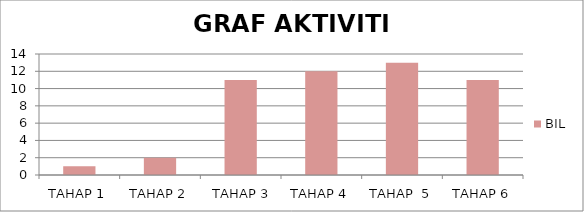
| Category | BIL |
|---|---|
| TAHAP 1 | 1 |
| TAHAP 2 | 2 |
|  TAHAP 3 | 11 |
| TAHAP 4 | 12 |
| TAHAP  5 | 13 |
| TAHAP 6 | 11 |